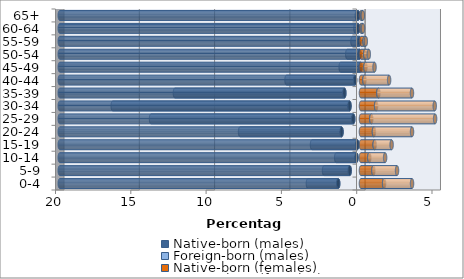
| Category | Native-born (males) | Foreign-born (males) | Native-born (females) | Foreign-born (females) |
|---|---|---|---|---|
| 0-4 | -1.509 | -2.013 | 1.537 | 1.856 |
| 5-9 | -0.748 | -1.704 | 0.826 | 1.571 |
| 10-14 | -0.297 | -1.346 | 0.555 | 1.051 |
| 15-19 | -0.245 | -3.005 | 0.91 | 1.128 |
| 20-24 | -1.288 | -6.741 | 0.863 | 2.53 |
| 25-29 | -0.51 | -13.429 | 0.688 | 4.237 |
| 30-34 | -0.761 | -15.723 | 1.007 | 3.893 |
| 35-39 | -1.102 | -11.252 | 1.159 | 2.23 |
| 40-44 | -0.389 | -4.553 | 0.232 | 1.639 |
| 45-49 | -0.036 | -1.313 | 0.3 | 0.602 |
| 50-54 | -0.092 | -0.818 | 0.288 | 0.235 |
| 55-59 | -0.115 | -0.448 | 0.243 | 0.083 |
| 60-64 | -0.193 | -0.174 | 0.082 | 0.058 |
| 65+ | -0.195 | -0.074 | 0.087 | 0.041 |